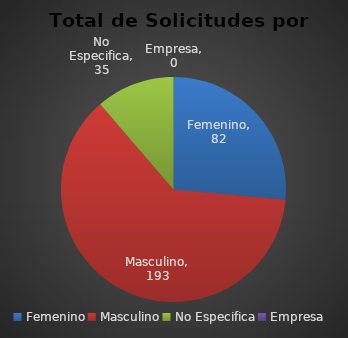
| Category | Series 0 |
|---|---|
| Femenino | 82 |
| Masculino | 193 |
| No Especifica | 35 |
| Empresa | 0 |